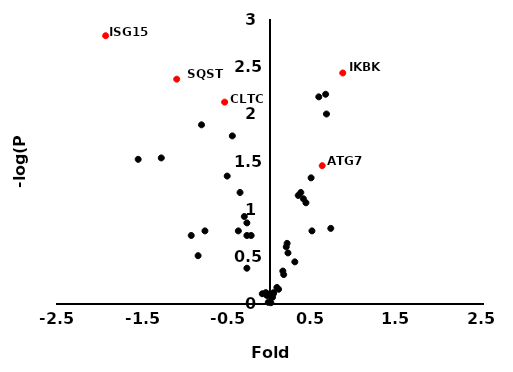
| Category | Series 0 |
|---|---|
| -1.27 | 1.538 |
| -1.54 | 1.523 |
| -0.76 | 0.77 |
| -0.92 | 0.721 |
| -0.37 | 0.77 |
| 0.48 | 1.328 |
| 0.1 | 0.155 |
| 0.15 | 0.347 |
| 0.61 | 1.456 |
| 0.08 | 0.174 |
| 0.57 | 2.18 |
| 0.29 | 0.444 |
| -0.3 | 0.921 |
| -0.53 | 2.125 |
| -0.27 | 0.377 |
| 0.49 | 0.77 |
| 0.33 | 1.143 |
| 0.03 | 0.071 |
| -0.44 | 1.77 |
| 0.04 | 0.108 |
| 0.85 | 2.432 |
| 0.71 | 0.796 |
| -0.27 | 0.721 |
| -0.05 | 0.119 |
| 0.66 | 2 |
| -0.35 | 1.174 |
| -0.27 | 0.854 |
| 0.16 | 0.31 |
| 0.21 | 0.538 |
| -0.04 | 0.108 |
| -0.5 | 1.347 |
| -0.09 | 0.108 |
| 0.19 | 0.602 |
| 0.2 | 0.638 |
| -0.04 | 0.114 |
| 0.04 | 0.119 |
| -0.8 | 1.886 |
| -1.09 | 2.367 |
| 0.39 | 1.108 |
| -0.02 | 0.018 |
| 0.01 | 0.013 |
| -0.03 | 0.086 |
| 0.42 | 1.066 |
| -0.22 | 0.721 |
| 0.65 | 2.208 |
| 0.36 | 1.174 |
| -0.84 | 0.509 |
| -0.05 | 0.102 |
| -1.92 | 2.824 |